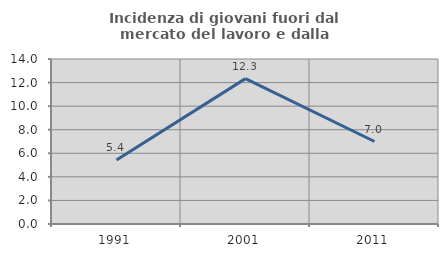
| Category | Incidenza di giovani fuori dal mercato del lavoro e dalla formazione  |
|---|---|
| 1991.0 | 5.424 |
| 2001.0 | 12.335 |
| 2011.0 | 7 |